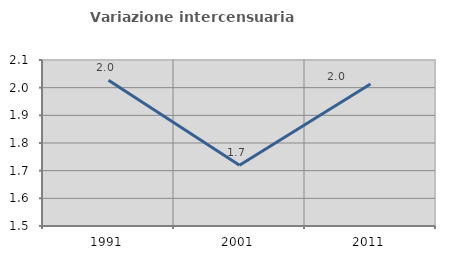
| Category | Variazione intercensuaria annua |
|---|---|
| 1991.0 | 2.027 |
| 2001.0 | 1.72 |
| 2011.0 | 2.014 |